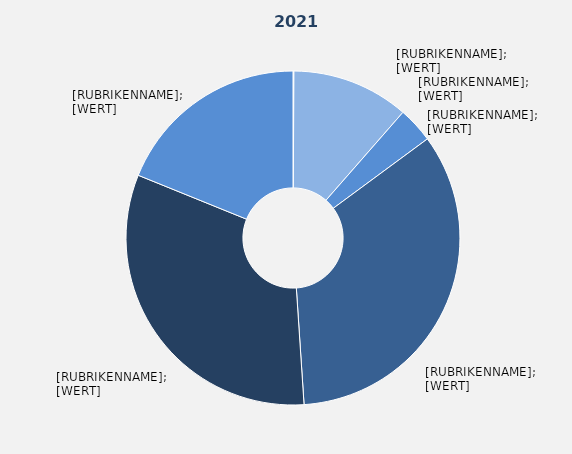
| Category | Series 1 |
|---|---|
| Land- und Forstwirtschaft, Fischerei | 0.088 |
| Produzierendes Gewerbe ohne Baugewerbe | 11.352 |
| Baugewerbe | 3.448 |
| Handel, Verkehr und Lagerei, Gastgewerbe, 
Information und Kommunikation | 34.058 |
| Finanz-, Versicherungs- und 
Unternehmensdienstleister, 
Grundstücks- und Wohnungswesen | 32.184 |
| Öffentliche und sonstige 
Dienstleister, Erziehung, 
Unterricht | 18.87 |